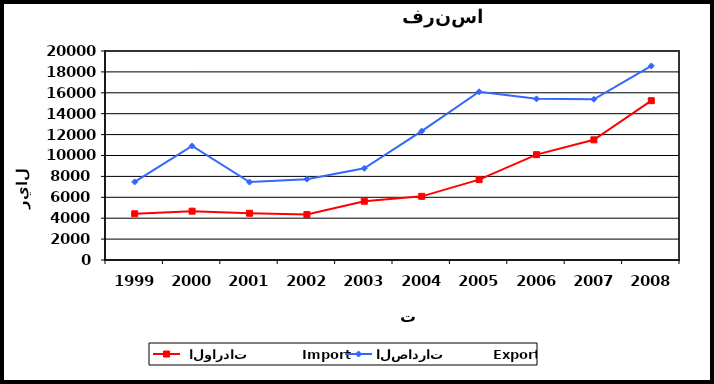
| Category |  الواردات           Import | الصادرات          Export |
|---|---|---|
| 1999.0 | 4421 | 7469 |
| 2000.0 | 4675 | 10910 |
| 2001.0 | 4473 | 7459 |
| 2002.0 | 4350 | 7738 |
| 2003.0 | 5624 | 8774 |
| 2004.0 | 6092 | 12335 |
| 2005.0 | 7687 | 16102 |
| 2006.0 | 10082 | 15420 |
| 2007.0 | 11499 | 15380 |
| 2008.0 | 15244 | 18568 |